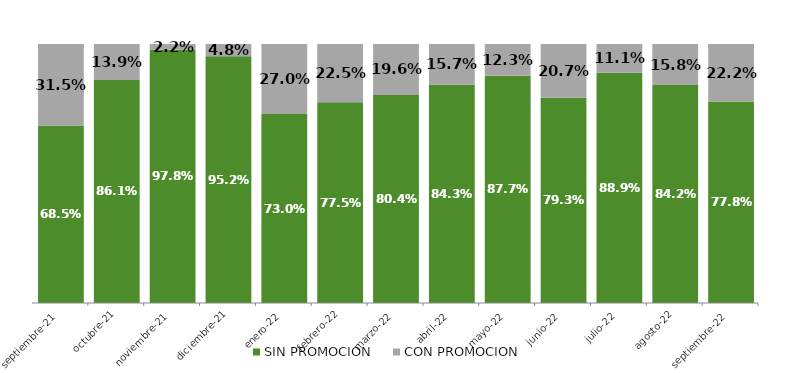
| Category | SIN PROMOCION   | CON PROMOCION   |
|---|---|---|
| 2021-09-01 | 0.685 | 0.315 |
| 2021-10-01 | 0.861 | 0.139 |
| 2021-11-01 | 0.978 | 0.022 |
| 2021-12-01 | 0.952 | 0.048 |
| 2022-01-01 | 0.73 | 0.27 |
| 2022-02-01 | 0.775 | 0.225 |
| 2022-03-01 | 0.804 | 0.196 |
| 2022-04-01 | 0.843 | 0.157 |
| 2022-05-01 | 0.877 | 0.123 |
| 2022-06-01 | 0.793 | 0.207 |
| 2022-07-01 | 0.889 | 0.111 |
| 2022-08-01 | 0.842 | 0.158 |
| 2022-09-01 | 0.778 | 0.222 |